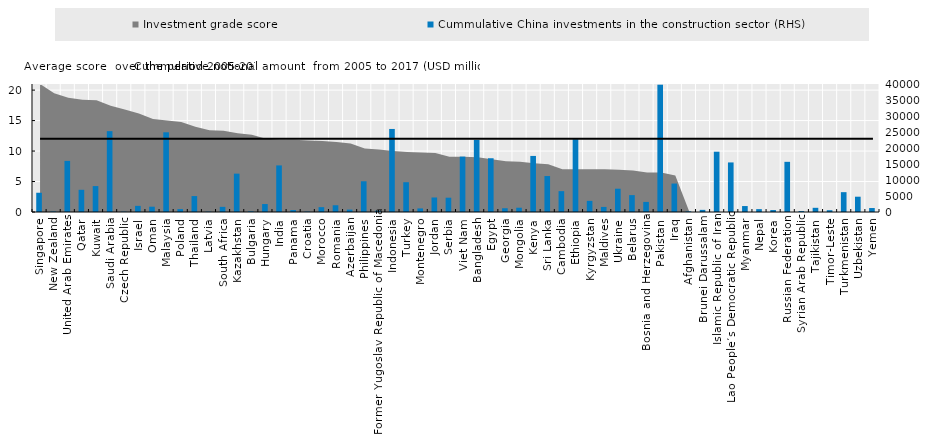
| Category | Cummulative China investments in the construction sector (RHS) |
|---|---|
| Singapore | 6020 |
| New Zealand | 150 |
| United Arab Emirates | 15970 |
| Qatar | 6940 |
| Kuwait | 8100 |
| Saudi Arabia | 25270 |
| Czech Republic | 100 |
| Israel | 1920 |
| Oman | 1660 |
| Malaysia | 24910 |
| Poland | 900 |
| Thailand | 4980 |
| Latvia | 110 |
| South Africa | 1610 |
| Kazakhstan | 11990 |
| Bulgaria | 210 |
| Hungary | 2490 |
| India | 14560 |
| Panama | 610 |
| Croatia | 130 |
| Morocco | 1520 |
| Romania | 2110 |
| Azerbaijan | 750 |
| Philippines | 9600 |
| Former Yugoslav Republic of Macedonia | 400 |
| Indonesia | 25950 |
| Turkey | 9310 |
| Montenegro | 1120 |
| Jordan | 4540 |
| Serbia | 4470 |
| Viet Nam | 17310 |
| Bangladesh | 22520 |
| Egypt | 16800 |
| Georgia | 1180 |
| Mongolia | 1340 |
| Kenya | 17520 |
| Sri Lanka | 11240 |
| Cambodia | 6520 |
| Ethiopia | 22740 |
| Kyrgyzstan | 3480 |
| Maldives | 1590 |
| Ukraine | 7280 |
| Belarus | 5280 |
| Bosnia and Herzegovina | 3150 |
| Pakistan | 39780 |
| Iraq | 8890 |
| Afghanistan | 210 |
| Brunei Darussalam | 670 |
| Islamic Republic of Iran | 18840 |
| Lao People’s Democratic Republic | 15490 |
| Myanmar | 1860 |
| Nepal | 900 |
| Korea | 610 |
| Russian Federation | 15680 |
| Syrian Arab Republic | 300 |
| Tajikistan | 1310 |
| Timor-Leste | 560 |
| Turkmenistan | 6200 |
| Uzbekistan | 4780 |
| Yemen | 1240 |